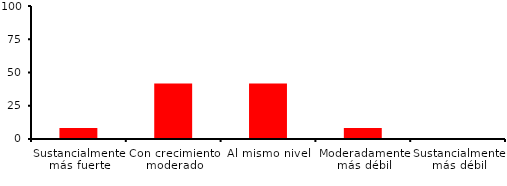
| Category | Series 0 |
|---|---|
| Sustancialmente más fuerte | 8.333 |
| Con crecimiento moderado | 41.667 |
| Al mismo nivel | 41.667 |
| Moderadamente más débil | 8.333 |
| Sustancialmente más débil | 0 |